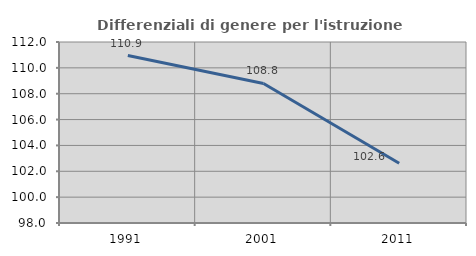
| Category | Differenziali di genere per l'istruzione superiore |
|---|---|
| 1991.0 | 110.95 |
| 2001.0 | 108.796 |
| 2011.0 | 102.617 |